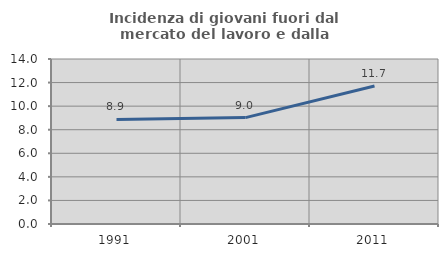
| Category | Incidenza di giovani fuori dal mercato del lavoro e dalla formazione  |
|---|---|
| 1991.0 | 8.876 |
| 2001.0 | 9.028 |
| 2011.0 | 11.712 |